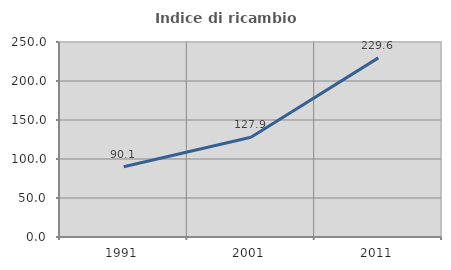
| Category | Indice di ricambio occupazionale  |
|---|---|
| 1991.0 | 90.128 |
| 2001.0 | 127.923 |
| 2011.0 | 229.623 |